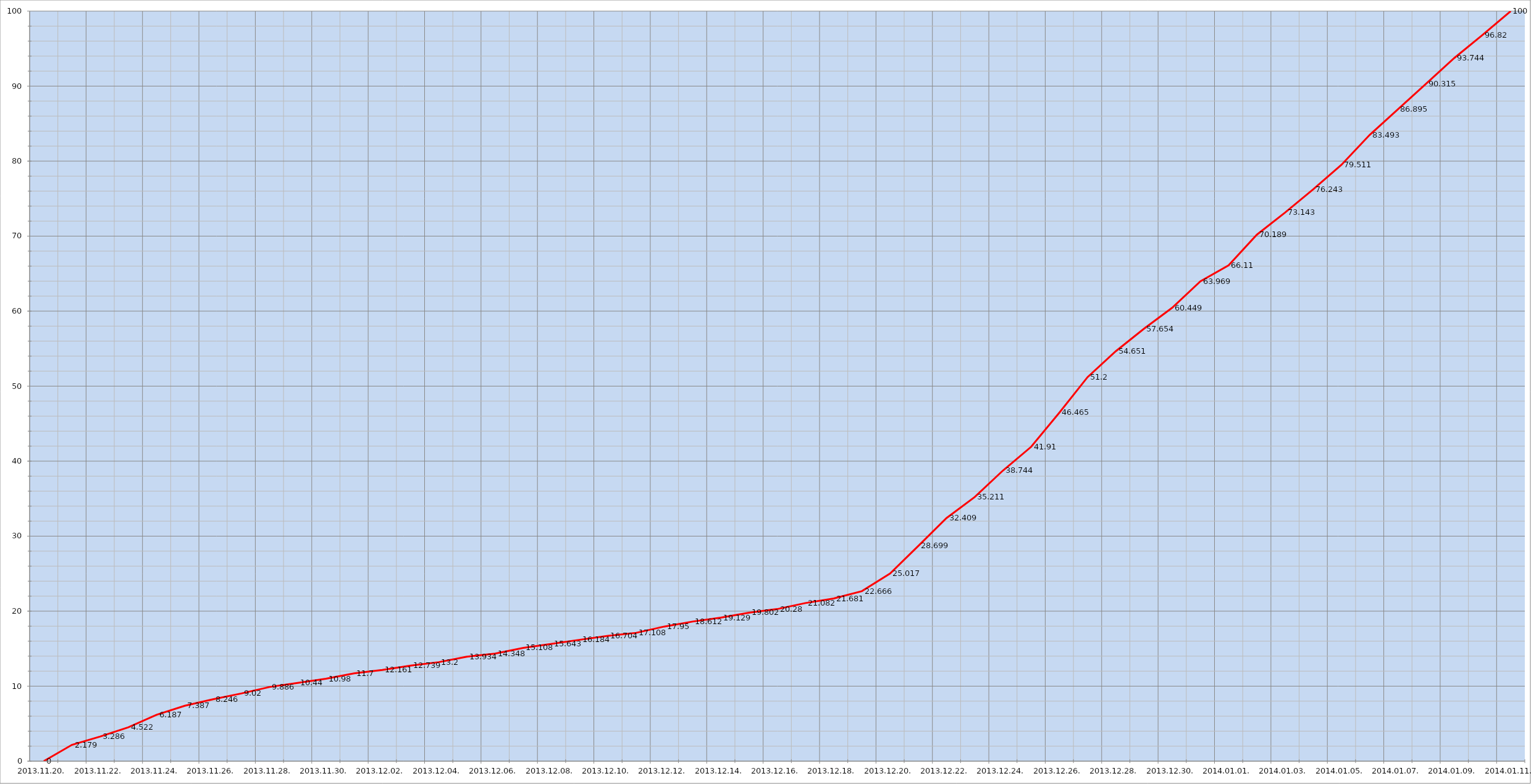
| Category | Szerver 10 |
|---|---|
| 2013-11-20 | 0 |
| 2013-11-21 | 2.179 |
| 2013-11-22 | 3.286 |
| 2013-11-23 | 4.522 |
| 2013-11-24 | 6.187 |
| 2013-11-25 | 7.387 |
| 2013-11-26 | 8.246 |
| 2013-11-27 | 9.02 |
| 2013-11-28 | 9.886 |
| 2013-11-29 | 10.44 |
| 2013-11-30 | 10.98 |
| 2013-12-01 | 11.7 |
| 2013-12-02 | 12.161 |
| 2013-12-03 | 12.739 |
| 2013-12-04 | 13.2 |
| 2013-12-05 | 13.934 |
| 2013-12-06 | 14.348 |
| 2013-12-07 | 15.108 |
| 2013-12-08 | 15.643 |
| 2013-12-09 | 16.184 |
| 2013-12-10 | 16.704 |
| 2013-12-11 | 17.108 |
| 2013-12-12 | 17.95 |
| 2013-12-13 | 18.612 |
| 2013-12-14 | 19.129 |
| 2013-12-15 | 19.802 |
| 2013-12-16 | 20.28 |
| 2013-12-17 | 21.082 |
| 2013-12-18 | 21.681 |
| 2013-12-19 | 22.666 |
| 2013-12-20 | 25.017 |
| 2013-12-21 | 28.699 |
| 2013-12-22 | 32.409 |
| 2013-12-23 | 35.211 |
| 2013-12-24 | 38.744 |
| 2013-12-25 | 41.91 |
| 2013-12-26 | 46.465 |
| 2013-12-27 | 51.2 |
| 2013-12-28 | 54.651 |
| 2013-12-29 | 57.654 |
| 2013-12-30 | 60.449 |
| 2013-12-31 | 63.969 |
| 2014-01-01 | 66.11 |
| 2014-01-02 | 70.189 |
| 2014-01-03 | 73.143 |
| 2014-01-04 | 76.243 |
| 2014-01-05 | 79.511 |
| 2014-01-06 | 83.493 |
| 2014-01-07 | 86.895 |
| 2014-01-08 | 90.315 |
| 2014-01-09 | 93.744 |
| 2014-01-10 | 96.82 |
| 2014-01-11 | 100 |